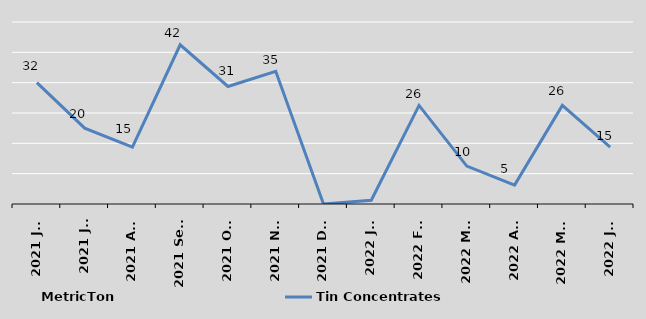
| Category | Tin Concentrates |
|---|---|
| 2021 Jun | 32 |
| 2021 Jul | 20 |
| 2021 Aug | 15 |
| 2021 Sept | 42 |
| 2021 Oct | 31 |
| 2021 Nov | 35 |
| 2021 Dec | 0 |
| 2022 Jan | 1 |
| 2022 Feb | 26 |
| 2022 Mar | 10 |
| 2022 Apr | 5 |
| 2022 May | 26 |
| 2022 Jun | 15 |